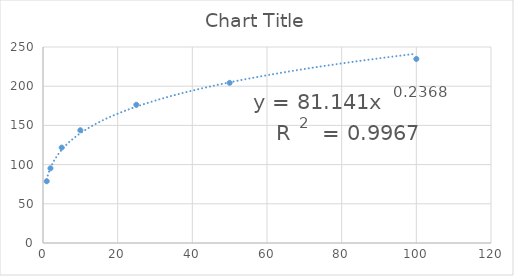
| Category | Series 0 |
|---|---|
| 1.0 | 78.759 |
| 2.0 | 95.272 |
| 5.0 | 121.695 |
| 10.0 | 143.798 |
| 25.0 | 176.318 |
| 50.0 | 204.264 |
| 100.0 | 234.751 |